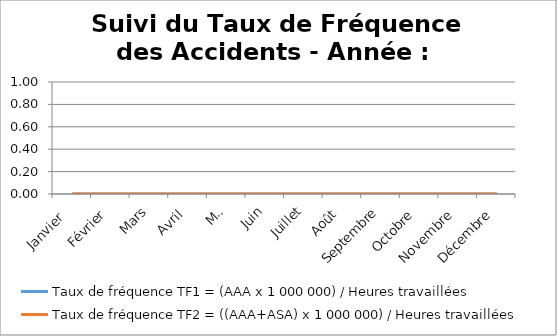
| Category | Taux de fréquence TF1 = (AAA x 1 000 000) / Heures travaillées | Taux de fréquence TF2 = ((AAA+ASA) x 1 000 000) / Heures travaillées |
|---|---|---|
| Janvier  | 0 | 0 |
| Février | 0 | 0 |
| Mars | 0 | 0 |
| Avril | 0 | 0 |
| Mai | 0 | 0 |
| Juin | 0 | 0 |
| Juillet | 0 | 0 |
| Août | 0 | 0 |
| Septembre | 0 | 0 |
| Octobre | 0 | 0 |
| Novembre | 0 | 0 |
| Décembre | 0 | 0 |